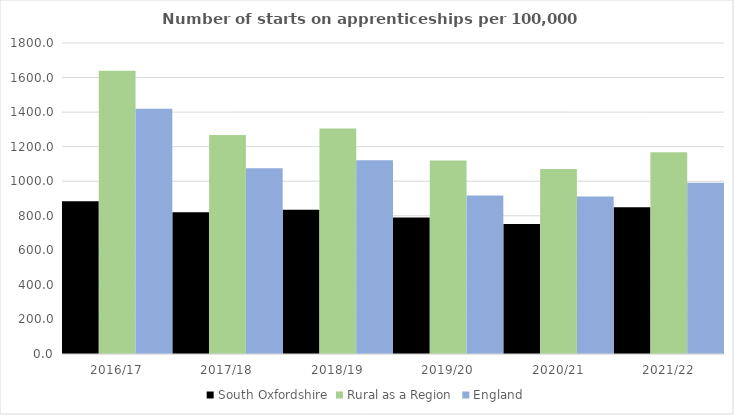
| Category | South Oxfordshire | Rural as a Region | England |
|---|---|---|---|
| 2016/17 | 884 | 1638.789 | 1420 |
| 2017/18 | 820 | 1267.474 | 1075 |
| 2018/19 | 835 | 1304.57 | 1122 |
| 2019/20 | 790 | 1119.662 | 918 |
| 2020/21 | 753 | 1070.748 | 912 |
| 2021/22 | 849 | 1167.68 | 991 |